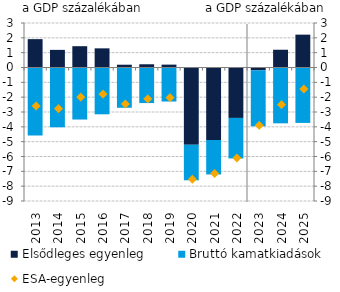
| Category | Elsődleges egyenleg | Bruttó kamatkiadások |
|---|---|---|
| 2013.0 | 1.912 | -4.51 |
| 2014.0 | 1.188 | -3.963 |
| 2015.0 | 1.436 | -3.44 |
| 2016.0 | 1.291 | -3.088 |
| 2017.0 | 0.188 | -2.647 |
| 2018.0 | 0.218 | -2.331 |
| 2019.0 | 0.194 | -2.225 |
| 2020.0 | -5.208 | -2.328 |
| 2021.0 | -4.888 | -2.255 |
| 2022.0 | -3.4 | -2.665 |
| 2023.0 | -0.189 | -3.707 |
| 2024.0 | 1.198 | -3.696 |
| 2025.0 | 2.215 | -3.669 |